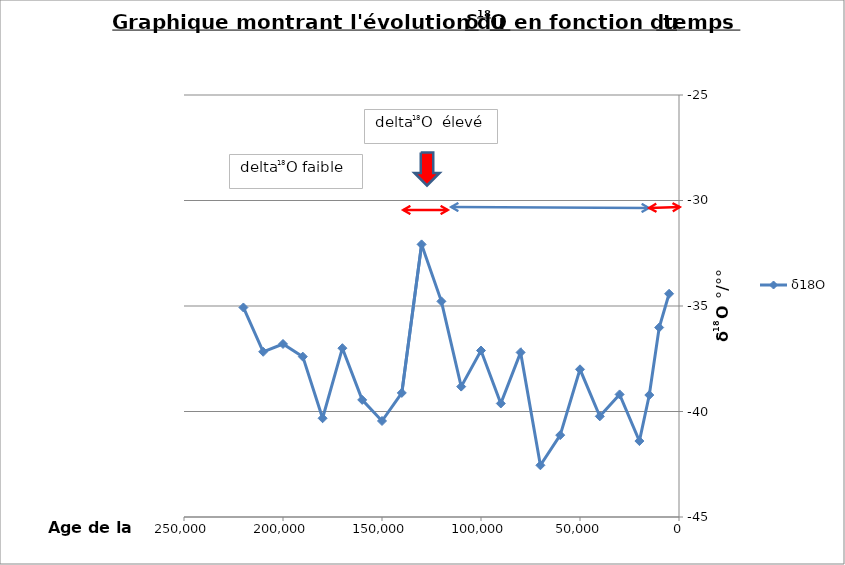
| Category | δ18O  |
|---|---|
| 5000.0 | -34.42 |
| 10000.0 | -36.02 |
| 15000.0 | -39.22 |
| 20000.0 | -41.4 |
| 30000.0 | -39.19 |
| 40000.0 | -40.23 |
| 50000.0 | -38 |
| 60000.0 | -41.12 |
| 70000.0 | -42.55 |
| 80000.0 | -37.2 |
| 90000.0 | -39.62 |
| 100000.0 | -37.11 |
| 110000.0 | -38.82 |
| 120000.0 | -34.78 |
| 130000.0 | -32.08 |
| 140000.0 | -39.12 |
| 150000.0 | -40.45 |
| 160000.0 | -39.45 |
| 170000.0 | -37 |
| 180000.0 | -40.32 |
| 190000.0 | -37.4 |
| 200000.0 | -36.8 |
| 210000.0 | -37.17 |
| 220000.0 | -35.07 |